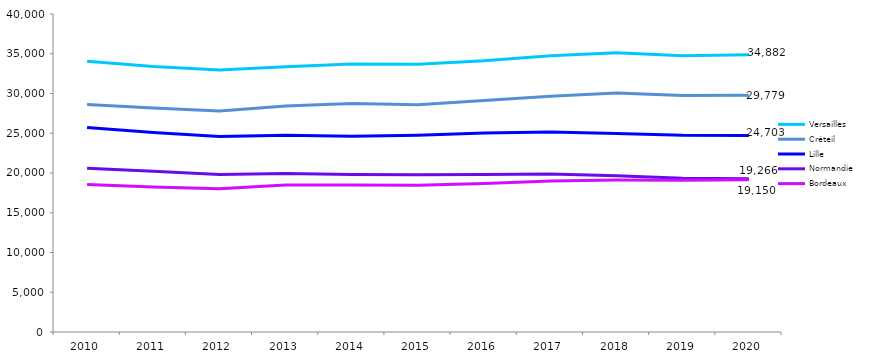
| Category | Versailles | Créteil | Lille | Normandie | Bordeaux |
|---|---|---|---|---|---|
| 2010.0 | 34066 | 28621 | 25730 | 20595 | 18559 |
| 2011.0 | 33400 | 28185 | 25086 | 20224 | 18224 |
| 2012.0 | 32966 | 27794 | 24599 | 19799 | 18016 |
| 2013.0 | 33367 | 28436 | 24735 | 19930 | 18499 |
| 2014.0 | 33696 | 28749 | 24623 | 19807 | 18483 |
| 2015.0 | 33692 | 28585 | 24754 | 19767 | 18459 |
| 2016.0 | 34114 | 29127 | 25041 | 19797 | 18692 |
| 2017.0 | 34757 | 29641 | 25145 | 19876 | 18981 |
| 2018.0 | 35120 | 30077 | 24976 | 19661 | 19106 |
| 2019.0 | 34734 | 29756 | 24733 | 19341 | 19086 |
| 2020.0 | 34882 | 29779 | 24703 | 19266 | 19150 |